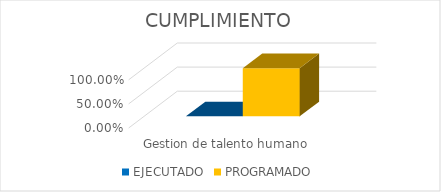
| Category | EJECUTADO | PROGRAMADO |
|---|---|---|
| Gestion de talento humano  | 0 | 1 |